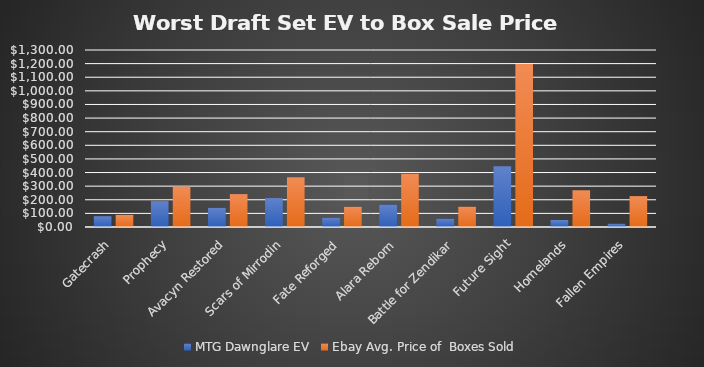
| Category | MTG Dawnglare EV | Ebay Avg. Price of  Boxes Sold |
|---|---|---|
| Gatecrash | 79.25 | 89.371 |
| Prophecy | 190.22 | 296.198 |
| Avacyn Restored | 141.23 | 241.578 |
| Scars of Mirrodin | 212.26 | 365.055 |
| Fate Reforged | 69.28 | 148.01 |
| Alara Reborn | 164.64 | 391.65 |
| Battle for Zendikar | 61 | 148.811 |
| Future Sight | 445.34 | 1197.327 |
| Homelands | 51.27 | 269.703 |
| Fallen Empires | 24.91 | 226.879 |